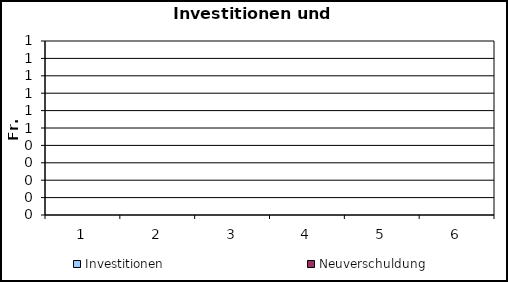
| Category | Investitionen | Neuverschuldung |
|---|---|---|
| 1.0 | 0 | 0 |
| 2.0 | 0 | 0 |
| 3.0 | 0 | 0 |
| 4.0 | 0 | 0 |
| 5.0 | 0 | 0 |
| 6.0 | 0 | 0 |